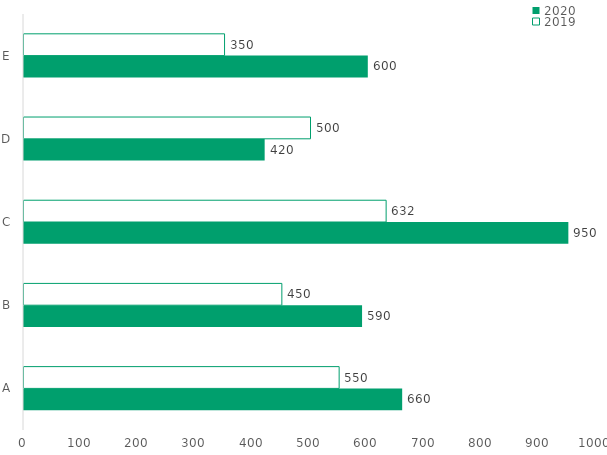
| Category | 2020 | 2019 |
|---|---|---|
| A | 660 | 550 |
| B | 590 | 450 |
| C | 950 | 632 |
| D | 420 | 500 |
| E | 600 | 350 |